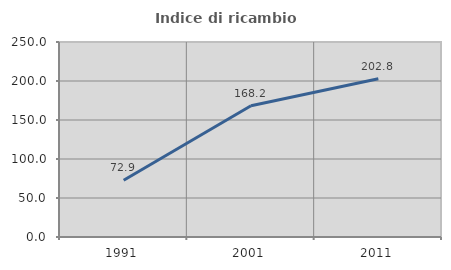
| Category | Indice di ricambio occupazionale  |
|---|---|
| 1991.0 | 72.857 |
| 2001.0 | 168.182 |
| 2011.0 | 202.817 |